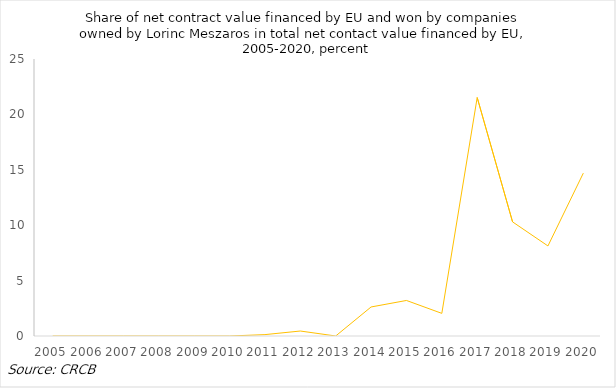
| Category | % |
|---|---|
| 2005.0 | 0 |
| 2006.0 | 0 |
| 2007.0 | 0 |
| 2008.0 | 0 |
| 2009.0 | 0 |
| 2010.0 | 0 |
| 2011.0 | 0.125 |
| 2012.0 | 0.449 |
| 2013.0 | 0.001 |
| 2014.0 | 2.62 |
| 2015.0 | 3.208 |
| 2016.0 | 2.042 |
| 2017.0 | 21.523 |
| 2018.0 | 10.299 |
| 2019.0 | 8.128 |
| 2020.0 | 14.698 |